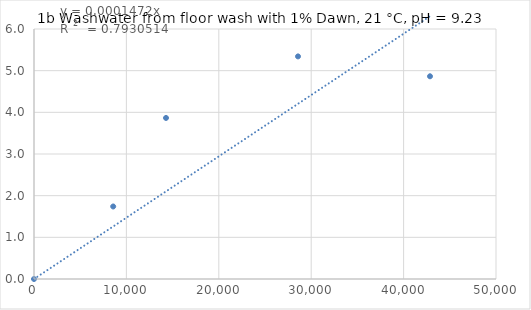
| Category | Series 0 |
|---|---|
| 0.0 | 0 |
| 8571.428571428572 | 1.74 |
| 14285.714285714286 | 3.865 |
| 28571.428571428572 | 5.342 |
| 42857.14285714286 | 4.865 |